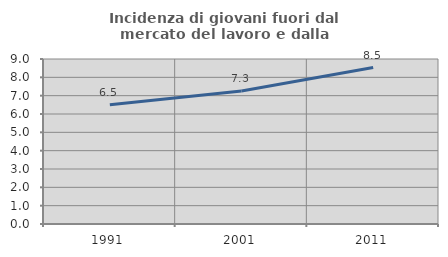
| Category | Incidenza di giovani fuori dal mercato del lavoro e dalla formazione  |
|---|---|
| 1991.0 | 6.509 |
| 2001.0 | 7.253 |
| 2011.0 | 8.536 |